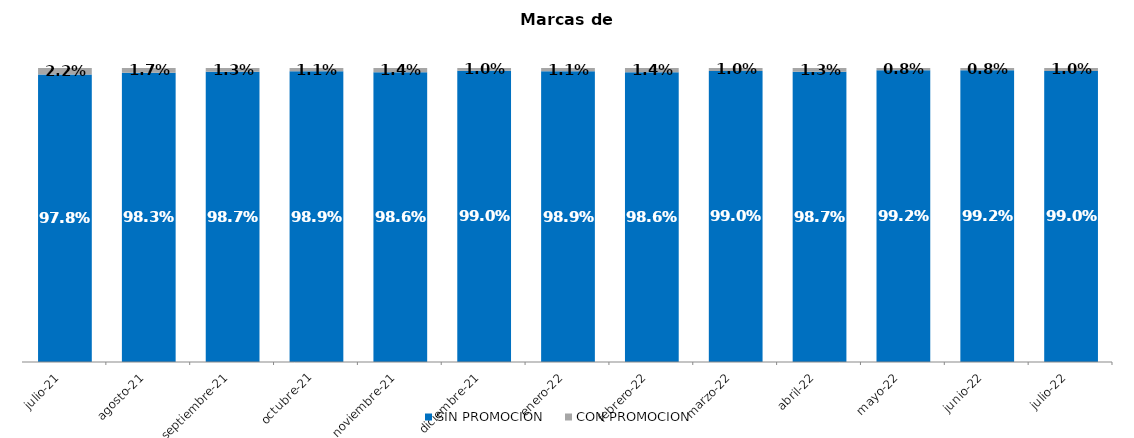
| Category | SIN PROMOCION   | CON PROMOCION   |
|---|---|---|
| 2021-07-01 | 0.978 | 0.022 |
| 2021-08-01 | 0.983 | 0.017 |
| 2021-09-01 | 0.987 | 0.013 |
| 2021-10-01 | 0.989 | 0.011 |
| 2021-11-01 | 0.986 | 0.014 |
| 2021-12-01 | 0.99 | 0.01 |
| 2022-01-01 | 0.989 | 0.011 |
| 2022-02-01 | 0.986 | 0.014 |
| 2022-03-01 | 0.99 | 0.01 |
| 2022-04-01 | 0.987 | 0.013 |
| 2022-05-01 | 0.992 | 0.008 |
| 2022-06-01 | 0.992 | 0.008 |
| 2022-07-01 | 0.99 | 0.01 |